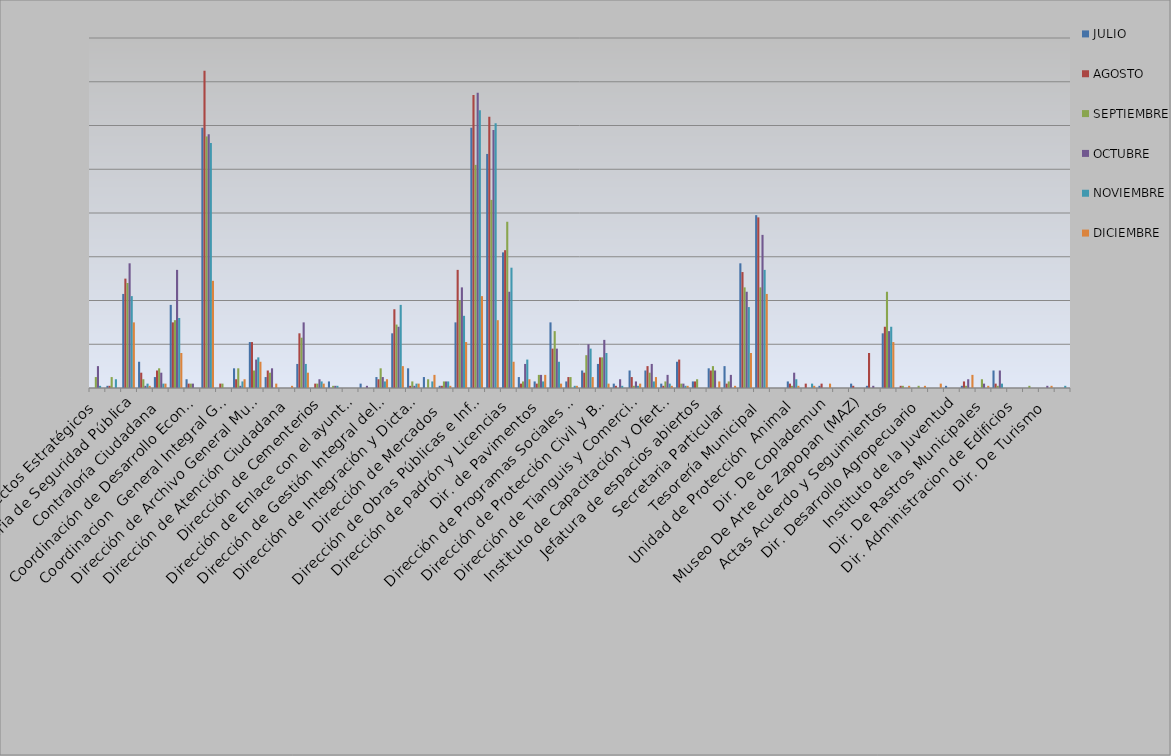
| Category | JULIO | AGOSTO | SEPTIEMBRE | OCTUBRE | NOVIEMBRE | DICIEMBRE |
|---|---|---|---|---|---|---|
| Area de Proyectos Estratégicos | 0 | 0 | 5 | 10 | 1 | 0 |
| Área de Relaciones Públicas | 1 | 1 | 5 | 0 | 4 | 0 |
| Comisaria de Seguridad Pública | 43 | 50 | 48 | 57 | 42 | 30 |
| Comunicación Social y Analisis Estrategico  | 12 | 7 | 4 | 1 | 2 | 1 |
| Contraloría Ciudadana | 5 | 8 | 9 | 7 | 2 | 2 |
| Coordinación General de Servicios Municipales | 38 | 30 | 31 | 54 | 32 | 16 |
| Coordinación de Desarrollo Económico Y Combate a la Desigualdad | 4 | 2 | 2 | 2 | 0 | 0 |
| Coordinación General de Administración e Innovación Gubernamental | 119 | 145 | 115 | 116 | 112 | 49 |
| Coordinacion  General Integral Gestion de la Ciudad | 0 | 2 | 2 | 0 | 0 | 0 |
| Dirección de Alumbrado Público | 9 | 4 | 9 | 1 | 3 | 4 |
| Dirección de Archivo General Municipal  | 21 | 21 | 8 | 13 | 14 | 12 |
| Dirección de Aseo Público  | 5 | 8 | 7 | 9 | 0 | 2 |
| Dirección de Atención Ciudadana | 0 | 0 | 0 | 0 | 0 | 1 |
| Dirección de Catastro | 11 | 25 | 23 | 30 | 11 | 7 |
| Dirección de Cementerios | 0 | 2 | 2 | 4 | 3 | 2 |
| Dirección de Educación  | 3 | 0 | 1 | 1 | 1 | 0 |
| Dirección de Enlace con el ayuntamiento | 0 | 0 | 0 | 0 | 0 | 0 |
| Dirección de Fomento al empleo y  emprendurismo         | 2 | 0 | 0 | 1 | 0 | 0 |
| Dirección de Gestión Integral del Agua y Drenaje | 5 | 4 | 9 | 5 | 3 | 4 |
| Dirección de Inspección y Vigilancia | 25 | 36 | 29 | 28 | 38 | 10 |
| Dirección de Integración y Dictaminación | 9 | 1 | 3 | 1 | 2 | 2 |
| Dirección de Mejoramiento Urbano | 5 | 0 | 4 | 0 | 3 | 6 |
| Dirección de Mercados  | 1 | 1 | 3 | 3 | 3 | 1 |
| Dirección  de Movilidad y Transporte | 30 | 54 | 40 | 46 | 33 | 21 |
| Dirección de Obras Públicas e Infraestructura | 119 | 134 | 102 | 135 | 127 | 42 |
| Dirección de Ordenamiento del Territorio  | 107 | 124 | 86 | 118 | 121 | 31 |
| Dirección de padrón y Licencias  | 62 | 63 | 76 | 44 | 55 | 12 |
| Dirección de Parques y Jardines  | 5 | 2 | 3 | 11 | 13 | 4 |
| Dir. de Pavimentos | 3 | 2 | 6 | 6 | 3 | 6 |
| Dirección de Participación Ciudadana | 30 | 18 | 26 | 18 | 12 | 2 |
| Dirección de Programas Sociales Municipales | 3 | 5 | 5 | 0 | 1 | 1 |
| Dirección de Protección al Medio Ambiente  | 8 | 7 | 15 | 20 | 18 | 5 |
| Dirección de Protección Civil y Bomberos | 11 | 14 | 14 | 22 | 16 | 2 |
| Dir. de Registro Civil | 2 | 1 | 0 | 4 | 1 | 0 |
| Dirección de Tianguis y Comercio en espacios Abiertos | 8 | 5 | 1 | 3 | 1 | 2 |
| Dirección de Transparencia y Buenas Prácticas | 8 | 10 | 7 | 11 | 3 | 5 |
| Instituto de Capacitación y Oferta Educativa | 2 | 1 | 3 | 6 | 2 | 1 |
| Instituto de Cultura  | 12 | 13 | 2 | 2 | 1 | 1 |
| Jefatura de espacios abiertos | 3 | 3 | 4 | 0 | 0 | 0 |
| Secretaría del Ayuntamiento | 9 | 8 | 10 | 8 | 0 | 3 |
| Secretaria Particular | 10 | 2 | 3 | 6 | 0 | 1 |
| Sindicatura Municipal | 57 | 53 | 46 | 44 | 37 | 16 |
| Tesorería Municipal | 79 | 78 | 46 | 70 | 54 | 43 |
| Unidad de Patrimonio Municipal  | 0 | 0 | 0 | 0 | 0 | 0 |
| Unidad de Protección  Animal  | 3 | 2 | 1 | 7 | 4 | 1 |
| Coord. Gral. De Construccion de la Comunidad | 0 | 2 | 0 | 0 | 2 | 1 |
| Dir. De Coplademun | 1 | 2 | 0 | 0 | 0 | 2 |
| Instituto de las Mujeres Zapopanas | 0 | 0 | 0 | 0 | 0 | 0 |
| Museo De Arte de Zapopan (MAZ) | 2 | 1 | 0 | 0 | 0 | 0 |
| Regidores | 1 | 16 | 0 | 1 | 0 | 0 |
| Actas Acuerdo y Seguimientos  | 25 | 28 | 44 | 26 | 28 | 21 |
| Dir. De Delegaciones y Agencias Municipales | 0 | 1 | 1 | 0 | 0 | 1 |
|  Dir. Desarrollo Agropecuario | 0 | 0 | 1 | 0 | 0 | 1 |
| Dir. Desarrollo Economico | 0 | 0 | 0 | 0 | 0 | 2 |
| Instituto de la Juventud | 1 | 0 | 0 | 0 | 0 | 0 |
| Dir. De Asuntos Internos | 1 | 3 | 1 | 4 | 0 | 6 |
| Dir. De Rastros Municipales | 0 | 0 | 4 | 2 | 0 | 1 |
| Jefatura de Gabinete | 8 | 2 | 1 | 8 | 2 | 0 |
| Dir. Administracion de Edificios | 0 | 0 | 0 | 0 | 0 | 0 |
| Sindicatos | 0 | 0 | 1 | 0 | 0 | 0 |
| Dir. De Turismo | 0 | 0 | 0 | 1 | 0 | 1 |
| Dir. Centro Historico | 0 | 0 | 0 | 0 | 1 | 0 |